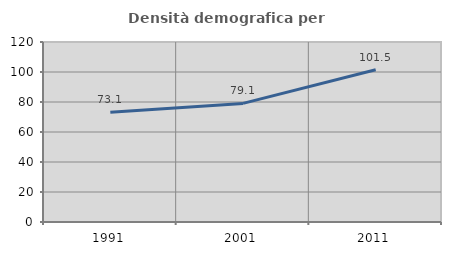
| Category | Densità demografica |
|---|---|
| 1991.0 | 73.093 |
| 2001.0 | 79.064 |
| 2011.0 | 101.492 |